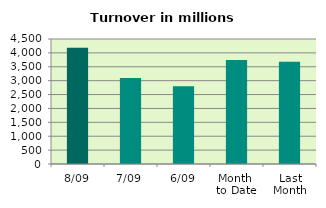
| Category | Series 0 |
|---|---|
| 8/09 | 4186.427 |
| 7/09 | 3099.971 |
| 6/09 | 2802.536 |
| Month 
to Date | 3740.034 |
| Last
Month | 3679.291 |